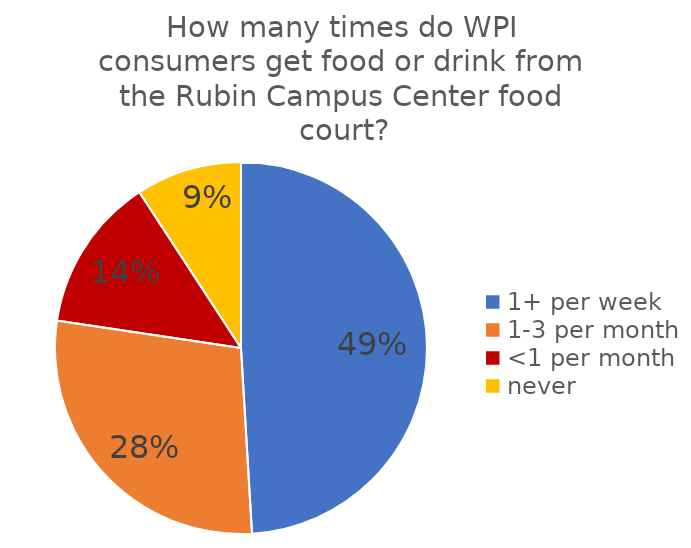
| Category | Series 0 |
|---|---|
| 1+ per week | 208 |
| 1-3 per month | 120 |
| <1 per month | 57 |
| never | 39 |